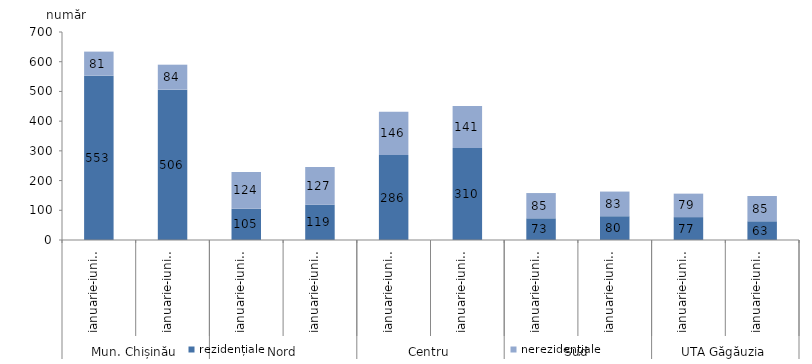
| Category | rezidențiale | nerezidențiale |
|---|---|---|
| 0 | 553 | 81 |
| 1 | 506 | 84 |
| 2 | 105 | 124 |
| 3 | 119 | 127 |
| 4 | 286 | 146 |
| 5 | 310 | 141 |
| 6 | 73 | 85 |
| 7 | 80 | 83 |
| 8 | 77 | 79 |
| 9 | 63 | 85 |